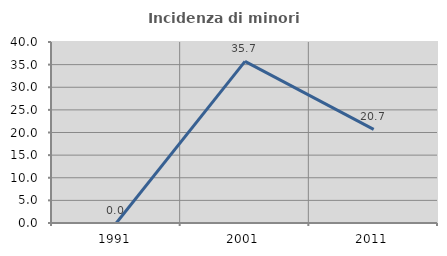
| Category | Incidenza di minori stranieri |
|---|---|
| 1991.0 | 0 |
| 2001.0 | 35.714 |
| 2011.0 | 20.69 |